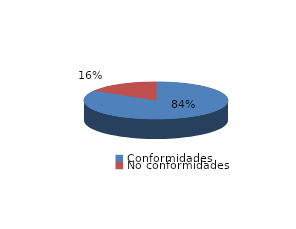
| Category | Series 0 |
|---|---|
| Conformidades | 1494 |
| No conformidades | 290 |